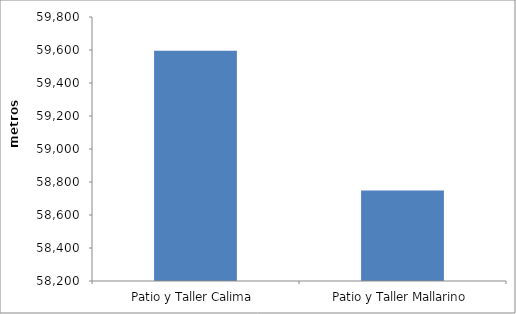
| Category | Series 0 |
|---|---|
| Patio y Taller Calima | 59594.74 |
| Patio y Taller Mallarino | 58748.92 |